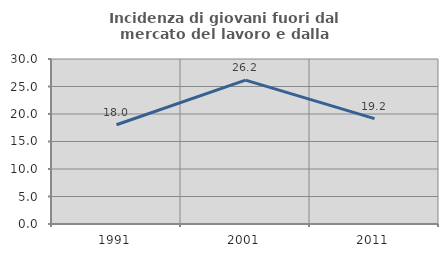
| Category | Incidenza di giovani fuori dal mercato del lavoro e dalla formazione  |
|---|---|
| 1991.0 | 18.05 |
| 2001.0 | 26.157 |
| 2011.0 | 19.162 |